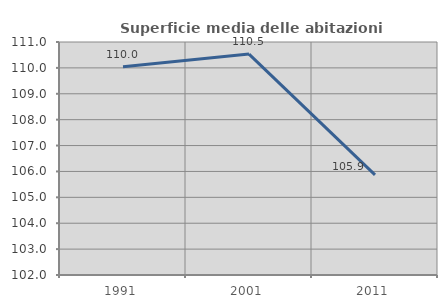
| Category | Superficie media delle abitazioni occupate |
|---|---|
| 1991.0 | 110.043 |
| 2001.0 | 110.532 |
| 2011.0 | 105.866 |